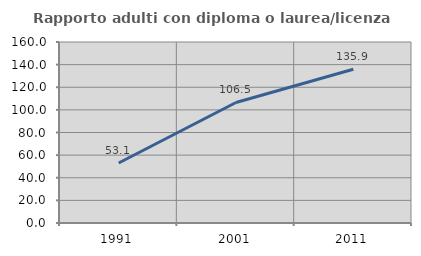
| Category | Rapporto adulti con diploma o laurea/licenza media  |
|---|---|
| 1991.0 | 53.056 |
| 2001.0 | 106.526 |
| 2011.0 | 135.87 |